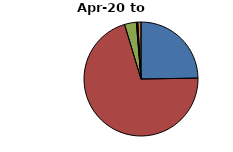
| Category | Percentage of total NIC
(%) |
|---|---|
| Antibacterial Drugs | 24.753 |
| Fluoride | 70.582 |
| Drugs acting on the oropharynx | 3.348 |
| Non-Steroidal Anti-Inflammatory Drugs (NSAIDs) | 0.2 |
| Analgesics | 0.218 |
| Other | 0.9 |